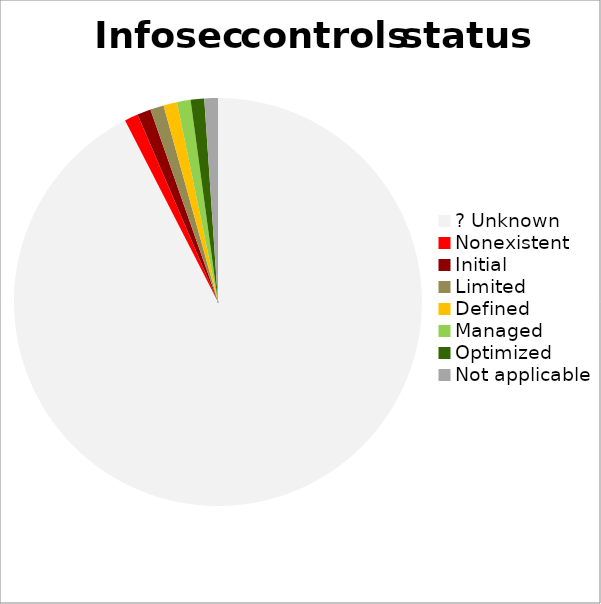
| Category | Proportion of information security controls |
|---|---|
| ? Unknown | 0.925 |
| Nonexistent | 0.011 |
| Initial | 0.011 |
| Limited | 0.011 |
| Defined | 0.011 |
| Managed | 0.011 |
| Optimized | 0.011 |
| Not applicable | 0.011 |